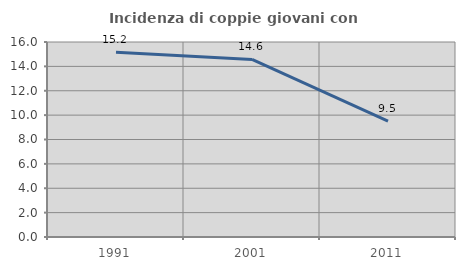
| Category | Incidenza di coppie giovani con figli |
|---|---|
| 1991.0 | 15.152 |
| 2001.0 | 14.57 |
| 2011.0 | 9.508 |